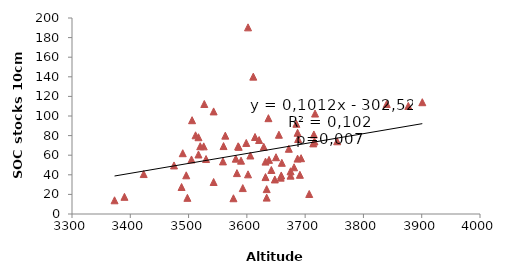
| Category | C10 |
|---|---|
| 3681.0 | 47.656 |
| 3602.0 | 190.46 |
| 3637.0 | 97.771 |
| 3687.0 | 56.529 |
| 3901.0 | 114.064 |
| 3877.0 | 110.272 |
| 3840.0 | 112.266 |
| 3755.0 | 74.214 |
| 3621.0 | 75.493 |
| 3506.0 | 95.696 |
| 3563.0 | 79.973 |
| 3505.0 | 55.647 |
| 3490.0 | 62.035 |
| 3527.0 | 112.24 |
| 3658.0 | 37.113 |
| 3593.0 | 26.448 |
| 3577.0 | 16.075 |
| 3543.0 | 32.652 |
| 3498.0 | 16.496 |
| 3581.0 | 56.442 |
| 3560.0 | 69.311 |
| 3512.0 | 80.297 |
| 3517.0 | 60.733 |
| 3373.0 | 13.992 |
| 3390.0 | 17.528 |
| 3685.0 | 92.069 |
| 3655.0 | 80.895 |
| 3530.0 | 56.097 |
| 3687.0 | 82.906 |
| 3714.0 | 72.052 |
| 3543.0 | 104.687 |
| 3611.0 | 140.163 |
| 3659.0 | 39.318 |
| 3606.0 | 59.683 |
| 3599.0 | 72.512 |
| 3629.0 | 68.582 |
| 3614.0 | 78.58 |
| 3559.0 | 53.682 |
| 3590.0 | 54.422 |
| 3715.0 | 81.16 |
| 3707.0 | 20.421 |
| 3648.0 | 35.267 |
| 3675.0 | 43.593 |
| 3650.0 | 57.927 |
| 3638.0 | 55.231 |
| 3642.0 | 44.926 |
| 3660.0 | 52.242 |
| 3675.0 | 39.147 |
| 3691.0 | 40.002 |
| 3693.0 | 56.941 |
| 3688.0 | 76.522 |
| 3520.0 | 69.15 |
| 3488.0 | 27.54 |
| 3496.0 | 39.485 |
| 3526.0 | 69.032 |
| 3423.0 | 40.753 |
| 3475.0 | 49.552 |
| 3672.0 | 66.581 |
| 3632.0 | 53.448 |
| 3602.0 | 40.473 |
| 3632.0 | 37.674 |
| 3634.0 | 25.393 |
| 3634.0 | 16.724 |
| 3716.0 | 74.03 |
| 3717.0 | 102.5 |
| 3517.0 | 78.348 |
| 3583.0 | 41.735 |
| 3585.0 | 69.083 |
| 3586.0 | 68.553 |